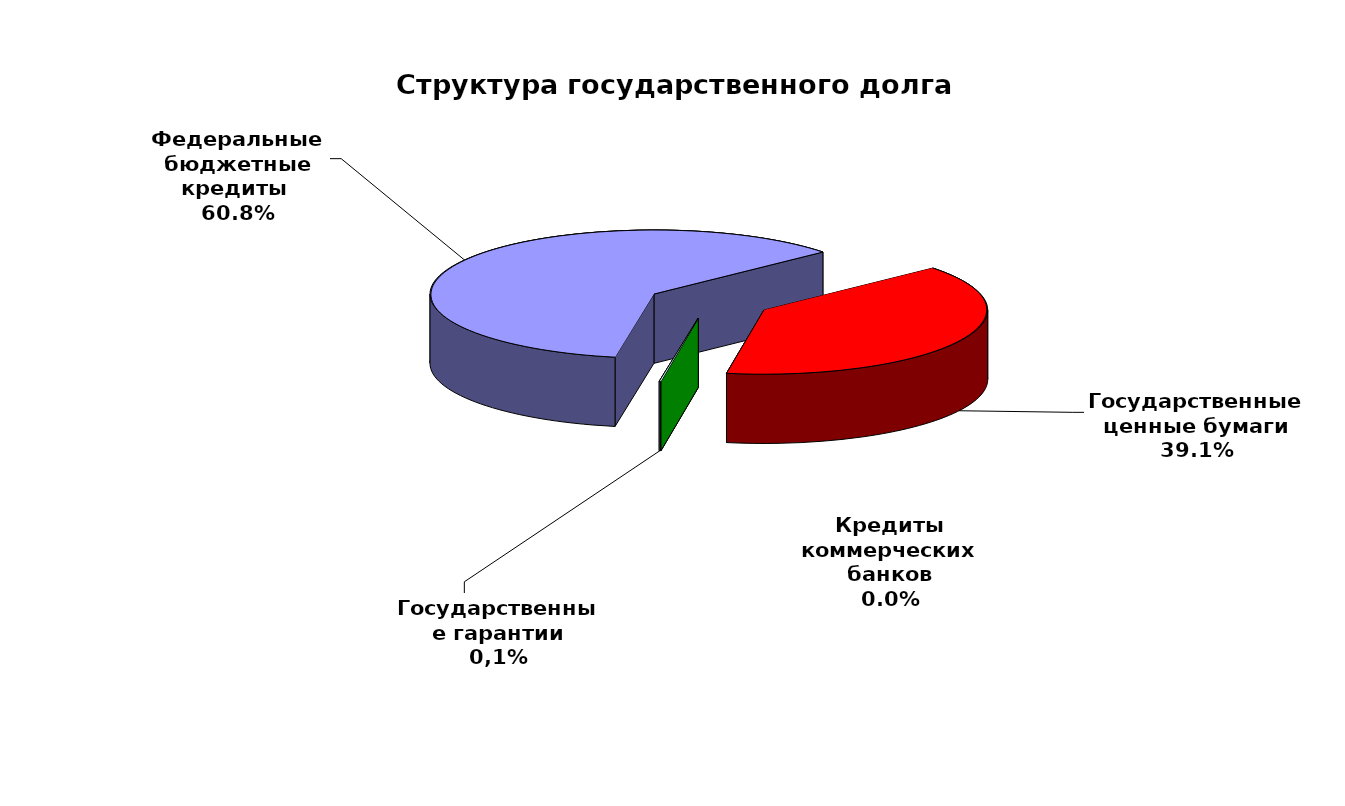
| Category | Series 0 |
|---|---|
| Федеральные бюджетные кредиты  | 72274148.94 |
| Государственные ценные бумаги | 46400000 |
| Кредиты коммерческих банков | 0 |
| Государственные гарантии | 134576.199 |